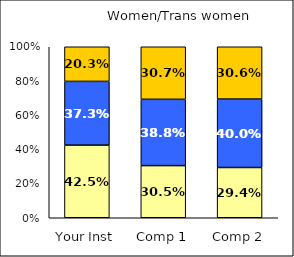
| Category | Low UG Ed Goal: Personal Development | Average UG Ed Goal: Personal Development | High UG Ed Goal: Personal Development |
|---|---|---|---|
| Your Inst | 0.425 | 0.373 | 0.203 |
| Comp 1 | 0.305 | 0.388 | 0.307 |
| Comp 2 | 0.294 | 0.4 | 0.306 |